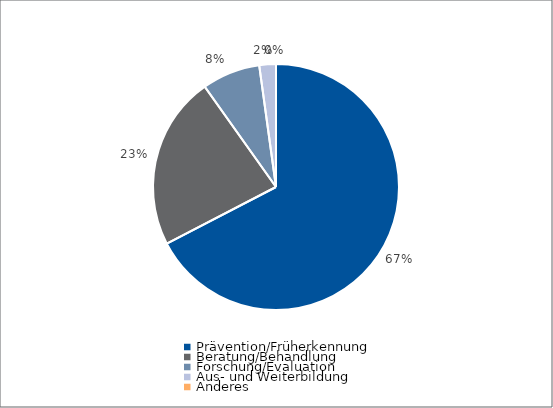
| Category | Series 0 |
|---|---|
| Prävention/Früherkennung | 123351 |
| Beratung/Behandlung | 41690 |
| Forschung/Evaluation | 14000 |
| Aus- und Weiterbildung | 4000 |
| Anderes | 0 |